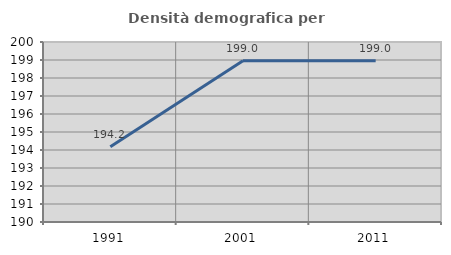
| Category | Densità demografica |
|---|---|
| 1991.0 | 194.185 |
| 2001.0 | 198.959 |
| 2011.0 | 198.959 |